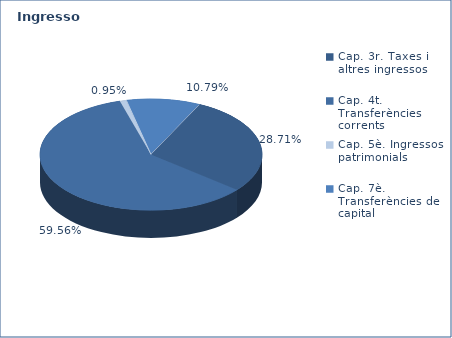
| Category | Series 0 |
|---|---|
| Cap. 3r. Taxes i altres ingressos | 81288736 |
| Cap. 4t. Transferències corrents | 168662585 |
| Cap. 5è. Ingressos patrimonials | 2687613 |
| Cap. 7è. Transferències de capital | 30546320 |
| Cap. 8è. Actius financers | 0 |
| Cap. 9è. Préstecs | 0 |